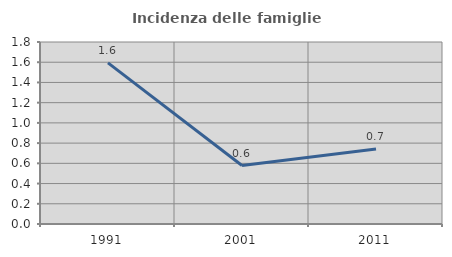
| Category | Incidenza delle famiglie numerose |
|---|---|
| 1991.0 | 1.594 |
| 2001.0 | 0.578 |
| 2011.0 | 0.741 |